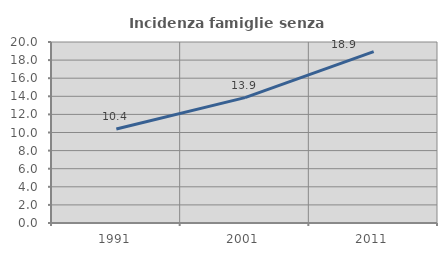
| Category | Incidenza famiglie senza nuclei |
|---|---|
| 1991.0 | 10.381 |
| 2001.0 | 13.85 |
| 2011.0 | 18.938 |